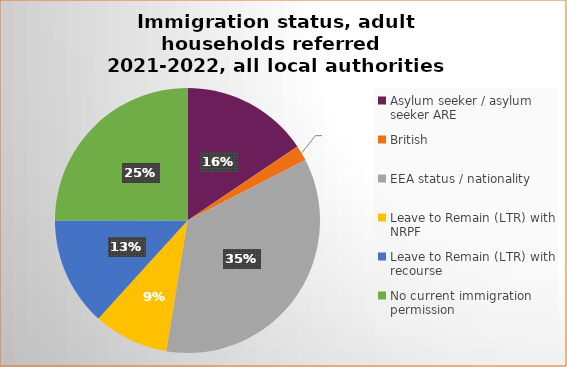
| Category | Number  | Percentage |
|---|---|---|
| Asylum seeker / asylum seeker ARE | 270 | 0.156 |
| British | 33 | 0.019 |
| EEA status / nationality  | 609 | 0.351 |
| Leave to Remain (LTR) with NRPF | 159 | 0.092 |
| Leave to Remain (LTR) with recourse | 230 | 0.133 |
| No current immigration permission | 434 | 0.25 |